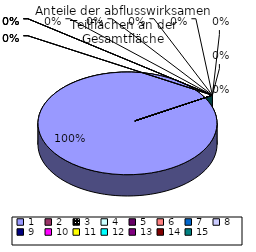
| Category | Series 0 |
|---|---|
| 0 | 90 |
| 1 | 0 |
| 2 | 0 |
| 3 | 0 |
| 4 | 0 |
| 5 | 0 |
| 6 | 0 |
| 7 | 0 |
| 8 | 0 |
| 9 | 0 |
| 10 | 0 |
| 11 | 0 |
| 12 | 0 |
| 13 | 0 |
| 14 | 0 |